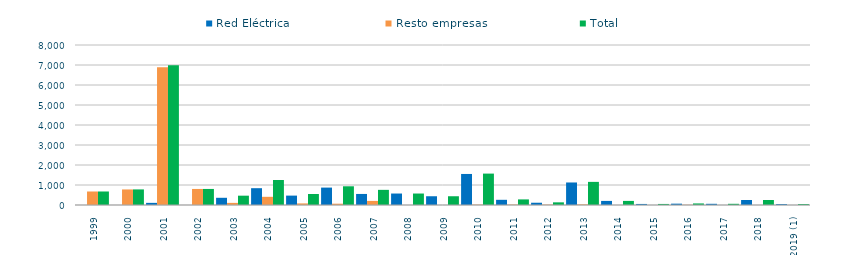
| Category | Red Eléctrica | Resto empresas | Total |
|---|---|---|---|
| 1999 | 0.46 | 675.17 | 675.63 |
| 2000 | 1.4 | 777.91 | 779.31 |
| 2001 | 107.04 | 6883.28 | 6990.32 |
| 2002 | 0.1 | 802.59 | 802.69 |
| 2003 | 360.4 | 105.83 | 466.23 |
| 2004 | 840.46 | 409.19 | 1249.65 |
| 2005 | 469.56 | 79.23 | 548.79 |
| 2006 | 870.41 | 65.39 | 935.8 |
| 2007 | 552.37 | 204.778 | 757.16 |
| 2008 | 573.542 | 0 | 573.542 |
| 2009 | 437.499 | 0 | 437.499 |
| 2010 | 1552.05 | 18.49 | 1570.54 |
| 2011 | 259.46 | 20.23 | 279.69 |
| 2012 | 113.47 | 19.29 | 132.77 |
| 2013 | 1126 | 30.18 | 1156.18 |
| 2014 | 204.34 | 0 | 204.34 |
| 2015 | 52.77 | 0 | 52.77 |
| 2016 | 66.945 | 11.025 | 77.97 |
| 2017 | 60.153 | 0 | 60.153 |
| 2018 | 250.127 | 0 | 250.127 |
| 2019 (1) | 46.54 | 0.94 | 47.48 |